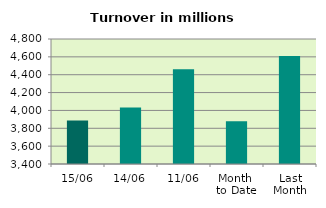
| Category | Series 0 |
|---|---|
| 15/06 | 3888.584 |
| 14/06 | 4032.897 |
| 11/06 | 4460.329 |
| Month 
to Date | 3880.104 |
| Last
Month | 4609.327 |